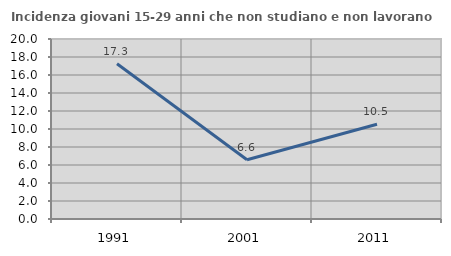
| Category | Incidenza giovani 15-29 anni che non studiano e non lavorano  |
|---|---|
| 1991.0 | 17.252 |
| 2001.0 | 6.587 |
| 2011.0 | 10.526 |